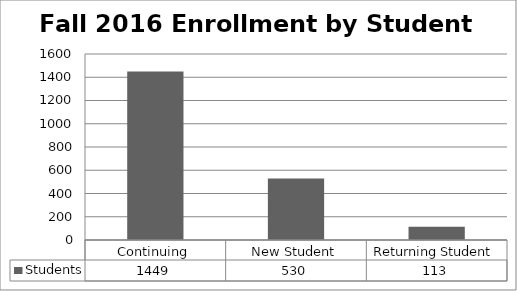
| Category | Students |
|---|---|
| Continuing | 1449 |
| New Student | 530 |
| Returning Student | 113 |